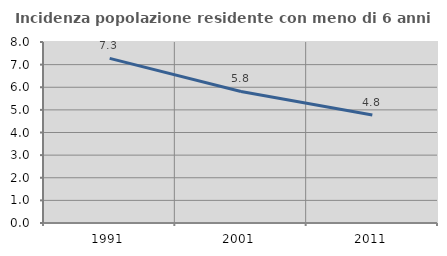
| Category | Incidenza popolazione residente con meno di 6 anni |
|---|---|
| 1991.0 | 7.277 |
| 2001.0 | 5.815 |
| 2011.0 | 4.77 |